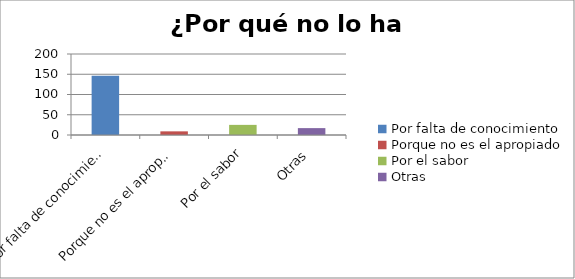
| Category | ¿Por qué no lo ha utilizado? |
|---|---|
| Por falta de conocimiento | 146 |
| Porque no es el apropiado | 9 |
| Por el sabor | 25 |
| Otras | 17 |